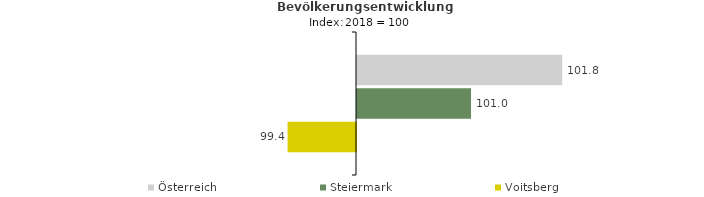
| Category | Österreich | Steiermark | Voitsberg |
|---|---|---|---|
| 2022.0 | 101.8 | 101 | 99.4 |